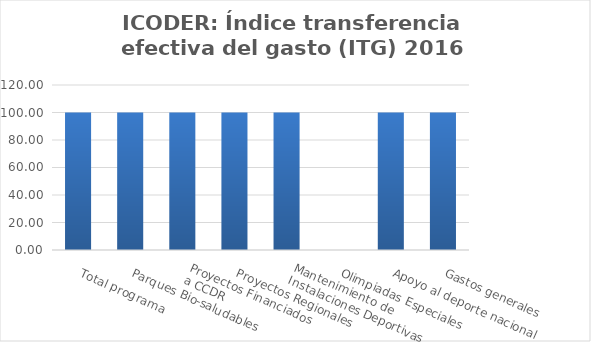
| Category | Índice transferencia efectiva del gasto (ITG) |
|---|---|
| Total programa | 100 |
| Parques Bio-saludables | 100 |
| Proyectos Financiados 
a CCDR | 100 |
| Proyectos Regionales  | 100 |
| Mantenimiento de 
Instalaciones Deportivas  | 100 |
| Olimpiadas Especiales  | 0 |
| Apoyo al deporte nacional | 100 |
| Gastos generales | 100 |